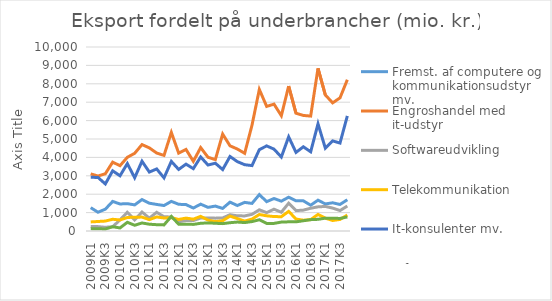
| Category | Fremst. af computere og kommunikationsudstyr mv. | Engroshandel med it-udstyr | Softwareudvikling | Telekommunikation | It-konsulenter mv. | Informationstjenester |
|---|---|---|---|---|---|---|
| 2009K1 | 1268.155 | 3103.88 | 250.07 | 493.07 | 2918.523 | 129.421 |
| 2009K2 | 1020.533 | 2988.303 | 238.017 | 516.453 | 2910.531 | 123.983 |
| 2009K3 | 1185.554 | 3111.42 | 201.752 | 539.377 | 2557.25 | 108.586 |
| 2009K4 | 1606.763 | 3741.716 | 233.306 | 637.623 | 3269.587 | 231.069 |
| 2010K1 | 1469.141 | 3549.895 | 602.195 | 598.342 | 3001.502 | 166.893 |
| 2010K2 | 1484.975 | 4005.294 | 1018.196 | 734.5 | 3663.824 | 472.393 |
| 2010K3 | 1418.267 | 4222.537 | 602.733 | 749.504 | 2893.912 | 311.738 |
| 2010K4 | 1709.273 | 4696.134 | 1029.918 | 755.536 | 3791.615 | 436.618 |
| 2011K1 | 1509.726 | 4518.225 | 698.183 | 617.748 | 3202.825 | 369.098 |
| 2011K2 | 1443.344 | 4237.435 | 1016.307 | 762.974 | 3373.822 | 342.854 |
| 2011K3 | 1384.176 | 4108.63 | 775.321 | 706.171 | 2887.933 | 331.733 |
| 2011K4 | 1609.884 | 5357.506 | 761.879 | 727.476 | 3783.068 | 793.016 |
| 2012K1 | 1451.796 | 4232.83 | 500.956 | 626.931 | 3345.515 | 369.182 |
| 2012K2 | 1434.907 | 4433.386 | 565.062 | 700.739 | 3633.096 | 365.093 |
| 2012K3 | 1248.178 | 3788.11 | 566.918 | 642.414 | 3388.495 | 359.363 |
| 2012K4 | 1458.358 | 4533.421 | 707.631 | 797.01 | 4023.537 | 418.349 |
| 2013K1 | 1285.375 | 4007.071 | 710.849 | 592.902 | 3585.382 | 440.815 |
| 2013K2 | 1353.068 | 3880.278 | 698.818 | 513.724 | 3684.164 | 420.704 |
| 2013K3 | 1228.436 | 5268.074 | 710.865 | 559.023 | 3338.245 | 400.214 |
| 2013K4 | 1569.452 | 4629.039 | 885.153 | 809.242 | 4049.738 | 451.026 |
| 2014K1 | 1384.583 | 4455.702 | 825.356 | 675.101 | 3770.65 | 485.569 |
| 2014K2 | 1555.069 | 4222.879 | 820.268 | 537.806 | 3603.661 | 458.346 |
| 2014K3 | 1499.57 | 5750.576 | 905.295 | 647.511 | 3554.862 | 512.654 |
| 2014K4 | 1977.928 | 7693.612 | 1152.347 | 897.058 | 4422.555 | 610.009 |
| 2015K1 | 1594.928 | 6771.461 | 998.326 | 825.15 | 4624.797 | 411.875 |
| 2015K2 | 1765.559 | 6894.556 | 1184.101 | 785.395 | 4449.436 | 413.678 |
| 2015K3 | 1621.931 | 6267.01 | 1020.043 | 776.875 | 4020.319 | 484.506 |
| 2015K4 | 1836.824 | 7874.855 | 1510.224 | 1066.5 | 5117.265 | 498.593 |
| 2016K1 | 1639.624 | 6399.73 | 1108.651 | 649.607 | 4270.765 | 498.814 |
| 2016K2 | 1639.511 | 6280.527 | 1134.373 | 586.656 | 4577.78 | 556.791 |
| 2016K3 | 1402.559 | 6246.145 | 1236.62 | 618.783 | 4304.663 | 616.782 |
| 2016K4 | 1674.632 | 8841.273 | 1313.004 | 899.309 | 5825.575 | 634.47 |
| 2017K1 | 1470.776 | 7393.415 | 1334.961 | 698.043 | 4501.94 | 698.746 |
| 2017K2 | 1533.097 | 6963.594 | 1245.191 | 571.061 | 4897.274 | 698.69 |
| 2017K3 | 1442.505 | 7236.096 | 1111.414 | 628.986 | 4779.075 | 681.183 |
| 2017K4 | 1699.338 | 8221.727 | 1357.287 | 868.989 | 6253.512 | 764.797 |